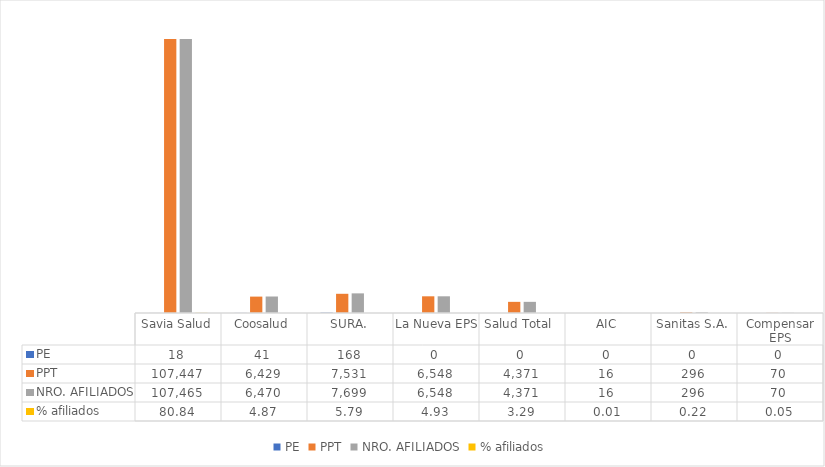
| Category | PE | PPT | NRO. AFILIADOS | % afiliados |
|---|---|---|---|---|
| Savia Salud | 18 | 107447 | 107465 | 80.84 |
| Coosalud | 41 | 6429 | 6470 | 4.867 |
| SURA. | 168 | 7531 | 7699 | 5.792 |
| La Nueva EPS | 0 | 6548 | 6548 | 4.926 |
| Salud Total  | 0 | 4371 | 4371 | 3.288 |
| AIC | 0 | 16 | 16 | 0.012 |
| Sanitas S.A. | 0 | 296 | 296 | 0.223 |
| Compensar EPS | 0 | 70 | 70 | 0.053 |